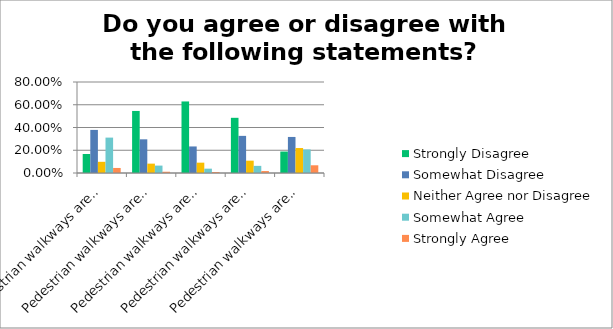
| Category | Strongly Disagree | Somewhat Disagree | Neither Agree nor Disagree | Somewhat Agree | Strongly Agree |
|---|---|---|---|---|---|
| Pedestrian walkways are cleared of snow and ice to a degree that I can easily get around | 0.167 | 0.379 | 0.098 | 0.311 | 0.044 |
| Pedestrian walkways are cleared of snow and ice to a degree that the elderly can easily get around | 0.546 | 0.296 | 0.082 | 0.065 | 0.011 |
| Pedestrian walkways are cleared of snow and ice to a degree that people with disabilities can easily get around | 0.629 | 0.233 | 0.091 | 0.038 | 0.009 |
| Pedestrian walkways are cleared of snow and ice to a degree that parents with children in strollers can easily get around | 0.485 | 0.326 | 0.108 | 0.063 | 0.017 |
| Pedestrian walkways are cleared of snow and ice to a degree that children can easily get around | 0.189 | 0.317 | 0.22 | 0.207 | 0.068 |